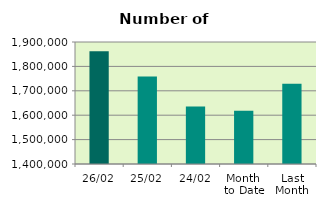
| Category | Series 0 |
|---|---|
| 26/02 | 1862228 |
| 25/02 | 1759054 |
| 24/02 | 1635906 |
| Month 
to Date | 1618522.4 |
| Last
Month | 1728874.4 |